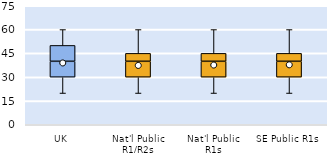
| Category | 25th | 50th | 75th |
|---|---|---|---|
| UK | 30 | 10 | 10 |
| Nat'l Public R1/R2s | 30 | 10 | 5 |
| Nat'l Public R1s | 30 | 10 | 5 |
| SE Public R1s | 30 | 10 | 5 |